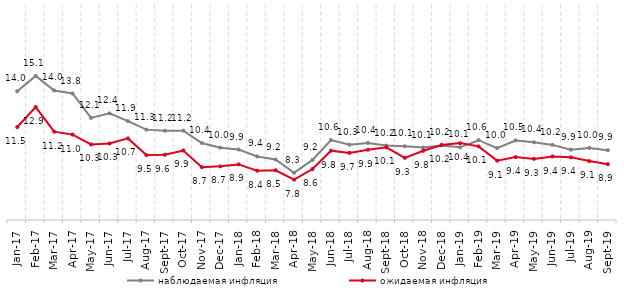
| Category | наблюдаемая инфляция | ожидаемая инфляция |
|---|---|---|
| 2017-01-01 | 13.983 | 11.486 |
| 2017-02-01 | 15.056 | 12.879 |
| 2017-03-01 | 14.037 | 11.162 |
| 2017-04-01 | 13.824 | 10.959 |
| 2017-05-01 | 12.123 | 10.27 |
| 2017-06-01 | 12.44 | 10.34 |
| 2017-07-01 | 11.9 | 10.692 |
| 2017-08-01 | 11.305 | 9.527 |
| 2017-09-01 | 11.229 | 9.556 |
| 2017-10-01 | 11.232 | 9.85 |
| 2017-11-01 | 10.372 | 8.687 |
| 2017-12-01 | 10.047 | 8.742 |
| 2018-01-01 | 9.916 | 8.879 |
| 2018-02-01 | 9.433 | 8.44 |
| 2018-03-01 | 9.218 | 8.469 |
| 2018-04-01 | 8.292 | 7.814 |
| 2018-05-01 | 9.192 | 8.556 |
| 2018-06-01 | 10.578 | 9.837 |
| 2018-07-01 | 10.255 | 9.682 |
| 2018-08-01 | 10.378 | 9.901 |
| 2018-09-01 | 10.196 | 10.07 |
| 2018-10-01 | 10.143 | 9.339 |
| 2018-11-01 | 10.053 | 9.831 |
| 2018-12-01 | 10.205 | 10.236 |
| 2019-01-01 | 10.071 | 10.363 |
| 2019-02-01 | 10.567 | 10.136 |
| 2019-03-01 | 10.013 | 9.141 |
| 2019-04-01 | 10.548 | 9.39 |
| 2019-05-01 | 10.421 | 9.264 |
| 2019-06-01 | 10.239 | 9.429 |
| 2019-07-01 | 9.904 | 9.371 |
| 2019-08-01 | 10.027 | 9.11 |
| 2019-09-01 | 9.867 | 8.894 |